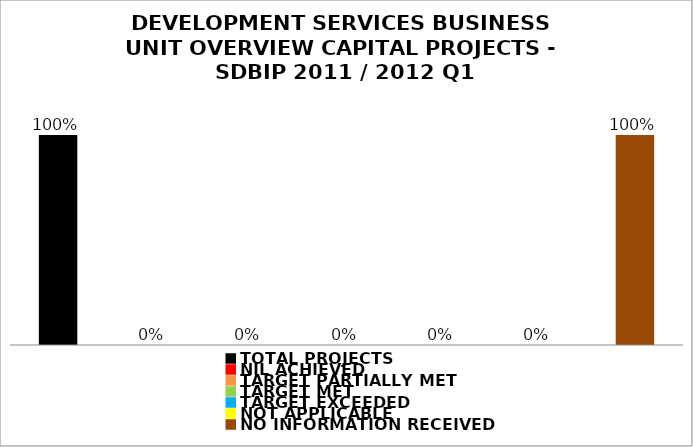
| Category | Series 1 |
|---|---|
| TOTAL PROJECTS | 1 |
| NIL ACHIEVED | 0 |
| TARGET PARTIALLY MET | 0 |
| TARGET MET | 0 |
| TARGET EXCEEDED | 0 |
| NOT APPLICABLE | 0 |
| NO INFORMATION RECEIVED | 1 |